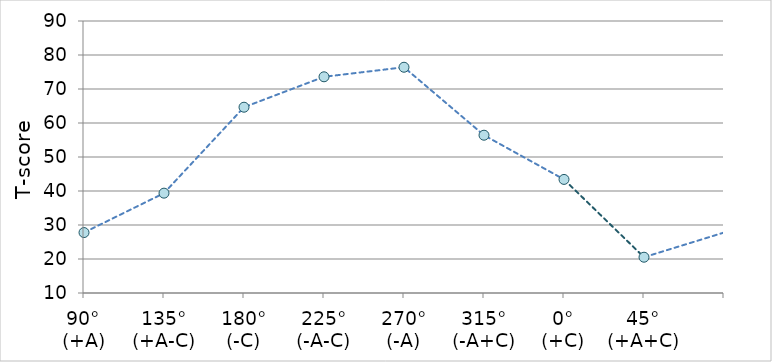
| Category | Z-scores |
|---|---|
| 90°
(+A) | 27.778 |
| 135°
(+A-C) | 39.366 |
| 180°
(-C) | 64.643 |
| 225°
(-A-C) | 73.59 |
| 270°
(-A) | 76.4 |
| 315°
(-A+C) | 56.408 |
| 0°
(+C) | 43.406 |
| 45°
(+A+C) | 20.526 |